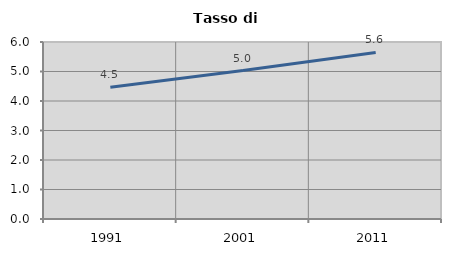
| Category | Tasso di disoccupazione   |
|---|---|
| 1991.0 | 4.467 |
| 2001.0 | 5.031 |
| 2011.0 | 5.645 |